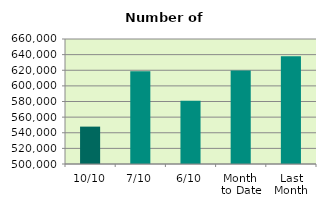
| Category | Series 0 |
|---|---|
| 10/10 | 547848 |
| 7/10 | 618600 |
| 6/10 | 580804 |
| Month 
to Date | 619836.333 |
| Last
Month | 637968.273 |